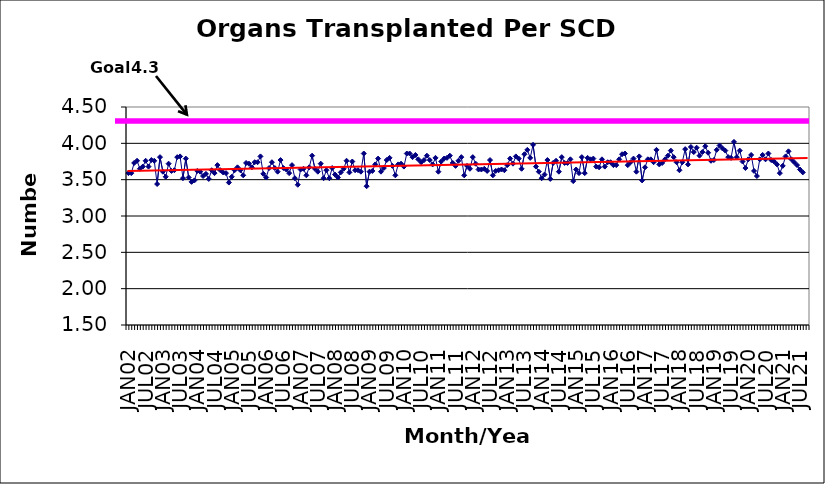
| Category | Series 0 |
|---|---|
| JAN02 | 3.59 |
| FEB02 | 3.59 |
| MAR02 | 3.73 |
| APR02 | 3.76 |
| MAY02 | 3.65 |
| JUN02 | 3.68 |
| JUL02 | 3.76 |
| AUG02 | 3.68 |
| SEP02 | 3.77 |
| OCT02 | 3.76 |
| NOV02 | 3.44 |
| DEC02 | 3.81 |
| JAN03 | 3.61 |
| FEB03 | 3.54 |
| MAR03 | 3.72 |
| APR03 | 3.62 |
| MAY03 | 3.63 |
| JUN03 | 3.81 |
| JUL03 | 3.82 |
| AUG03 | 3.52 |
| SEP03 | 3.79 |
| OCT03 | 3.53 |
| NOV03 | 3.47 |
| DEC03 | 3.49 |
| JAN04 | 3.62 |
| FEB04 | 3.61 |
| MAR04 | 3.55 |
| APR04 | 3.58 |
| MAY04 | 3.51 |
| JUN04 | 3.63 |
| JUL04 | 3.59 |
| AUG04 | 3.7 |
| SEP04 | 3.63 |
| OCT04 | 3.6 |
| NOV04 | 3.59 |
| DEC04 | 3.46 |
| JAN05 | 3.54 |
| FEB05 | 3.63 |
| MAR05 | 3.67 |
| APR05 | 3.63 |
| MAY05 | 3.56 |
| JUN05 | 3.73 |
| JUL05 | 3.72 |
| AUG05 | 3.67 |
| SEP05 | 3.74 |
| OCT05 | 3.74 |
| NOV05 | 3.82 |
| DEC05 | 3.58 |
| JAN06 | 3.53 |
| FEB06 | 3.66 |
| MAR06 | 3.74 |
| APR06 | 3.66 |
| MAY06 | 3.61 |
| JUN06 | 3.77 |
| JUL06 | 3.66 |
| AUG06 | 3.64 |
| SEP06 | 3.59 |
| OCT06 | 3.7 |
| NOV06 | 3.52 |
| DEC06 | 3.43 |
| JAN07 | 3.64 |
| FEB07 | 3.65 |
| MAR07 | 3.56 |
| APR07 | 3.67 |
| MAY07 | 3.83 |
| JUN07 | 3.65 |
| JUL07 | 3.61 |
| AUG07 | 3.72 |
| SEP07 | 3.52 |
| OCT07 | 3.63 |
| NOV07 | 3.52 |
| DEC07 | 3.66 |
| JAN08 | 3.57 |
| FEB08 | 3.53 |
| MAR08 | 3.6 |
| APR08 | 3.65 |
| MAY08 | 3.76 |
| JUN08 | 3.6 |
| JUL08 | 3.75 |
| AUG08 | 3.63 |
| SEP08 | 3.63 |
| OCT08 | 3.61 |
| NOV08 | 3.86 |
| DEC08 | 3.41 |
| JAN09 | 3.61 |
| FEB09 | 3.62 |
| MAR09 | 3.71 |
| APR09 | 3.79 |
| MAY09 | 3.61 |
| JUN09 | 3.66 |
| JUL09 | 3.77 |
| AUG09 | 3.8 |
| SEP09 | 3.69 |
| OCT09 | 3.56 |
| NOV09 | 3.71 |
| DEC09 | 3.72 |
| JAN10 | 3.68 |
| FEB10 | 3.86 |
| MAR10 | 3.86 |
| APR10 | 3.81 |
| MAY10 | 3.84 |
| JUN10 | 3.78 |
| JUL10 | 3.74 |
| AUG10 | 3.77 |
| SEP10 | 3.83 |
| OCT10 | 3.77 |
| NOV10 | 3.71 |
| DEC10 | 3.8 |
| JAN11 | 3.61 |
| FEB11 | 3.75 |
| MAR11 | 3.79 |
| APR11 | 3.8 |
| MAY11 | 3.83 |
| JUN11 | 3.73 |
| JUL11 | 3.69 |
| AUG11 | 3.76 |
| SEP11 | 3.81 |
| OCT11 | 3.56 |
| NOV11 | 3.69 |
| DEC11 | 3.65 |
| JAN12 | 3.81 |
| FEB12 | 3.72 |
| MAR12 | 3.64 |
| APR12 | 3.64 |
| MAY12 | 3.65 |
| JUN12 | 3.62 |
| JUL12 | 3.77 |
| AUG12 | 3.56 |
| SEP12 | 3.62 |
| OCT12 | 3.63 |
| NOV12 | 3.64 |
| DEC12 | 3.63 |
| JAN13 | 3.7 |
| FEB13 | 3.79 |
| MAR13 | 3.72 |
| APR13 | 3.82 |
| MAY13 | 3.79 |
| JUN13 | 3.65 |
| JUL13 | 3.85 |
| AUG13 | 3.91 |
| SEP13 | 3.8 |
| OCT13 | 3.98 |
| NOV13 | 3.68 |
| DEC13 | 3.61 |
| JAN14 | 3.52 |
| FEB14 | 3.57 |
| MAR14 | 3.77 |
| APR14 | 3.51 |
| MAY14 | 3.73 |
| JUN14 | 3.76 |
| JUL14 | 3.61 |
| AUG14 | 3.81 |
| SEP14 | 3.73 |
| OCT14 | 3.73 |
| NOV14 | 3.78 |
| DEC14 | 3.48 |
| JAN15 | 3.64 |
| FEB15 | 3.59 |
| MAR15 | 3.81 |
| APR15 | 3.59 |
| MAY15 | 3.8 |
| JUN15 | 3.78 |
| JUL15 | 3.79 |
| AUG15 | 3.68 |
| SEP15 | 3.67 |
| OCT15 | 3.78 |
| NOV15 | 3.68 |
| DEC15 | 3.74 |
| JAN16 | 3.74 |
| FEB16 | 3.7 |
| MAR16 | 3.7 |
| APR16 | 3.78 |
| MAY16 | 3.85 |
| JUN16 | 3.86 |
| JUL16 | 3.7 |
| AUG16 | 3.74 |
| SEP16 | 3.79 |
| OCT16 | 3.61 |
| NOV16 | 3.82 |
| DEC16 | 3.49 |
| JAN17 | 3.67 |
| FEB17 | 3.78 |
| MAR17 | 3.78 |
| APR17 | 3.74 |
| MAY17 | 3.91 |
| JUN17 | 3.71 |
| JUL17 | 3.73 |
| AUG17 | 3.78 |
| SEP17 | 3.83 |
| OCT17 | 3.9 |
| NOV17 | 3.81 |
| DEC17 | 3.74 |
| JAN18 | 3.63 |
| FEB18 | 3.74 |
| MAR18 | 3.92 |
| APR18 | 3.71 |
| MAY18 | 3.95 |
| JUN18 | 3.88 |
| JUL18 | 3.94 |
| AUG18 | 3.83 |
| SEP18 | 3.88 |
| OCT18 | 3.96 |
| NOV18 | 3.87 |
| DEC18 | 3.76 |
| JAN19 | 3.77 |
| FEB19 | 3.91 |
| MAR19 | 3.97 |
| APR19 | 3.93 |
| MAY19 | 3.9 |
| JUN19 | 3.81 |
| JUL19 | 3.8 |
| AUG19 | 4.02 |
| SEP19 | 3.81 |
| OCT19 | 3.9 |
| NOV19 | 3.75 |
| DEC19 | 3.66 |
| JAN20 | 3.78 |
| FEB20 | 3.84 |
| MAR20 | 3.62 |
| APR20 | 3.55 |
| MAY20 | 3.78 |
| JUN20 | 3.84 |
| JUL20 | 3.78 |
| AUG20 | 3.86 |
| SEP20 | 3.77 |
| OCT20 | 3.75 |
| NOV20 | 3.71 |
| DEC20 | 3.59 |
| JAN21 | 3.69 |
| FEB21 | 3.82 |
| MAR21 | 3.89 |
| APR21 | 3.78 |
| MAY21 | 3.74 |
| JUN21 | 3.7 |
| JUL21 | 3.64 |
| AUG21 | 3.6 |